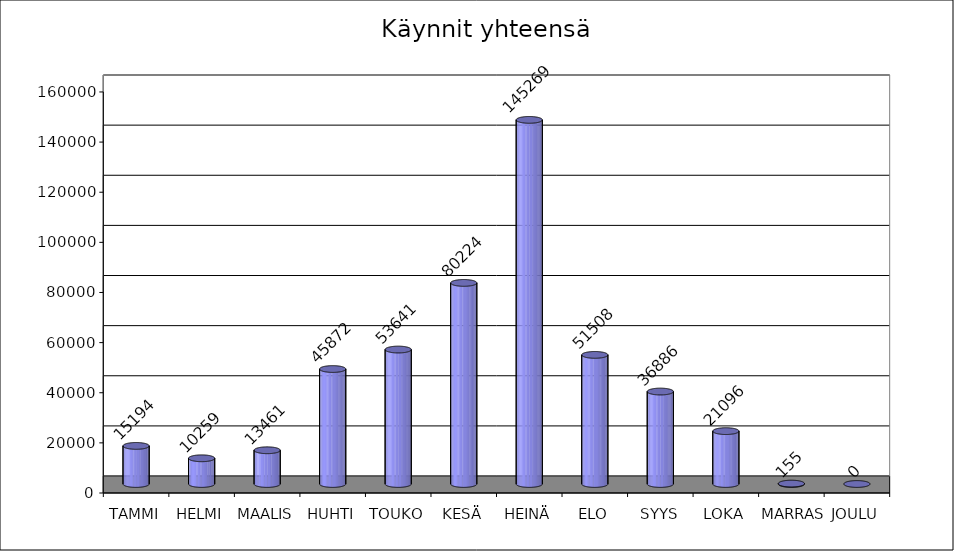
| Category | Series 0 |
|---|---|
| TAMMI | 15194 |
| HELMI | 10259 |
| MAALIS | 13461 |
| HUHTI | 45872 |
| TOUKO | 53641 |
| KESÄ | 80224 |
| HEINÄ | 145269 |
| ELO | 51508 |
| SYYS | 36886 |
| LOKA | 21096 |
| MARRAS | 155 |
| JOULU | 0 |